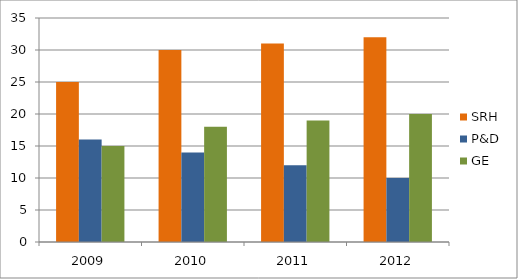
| Category | SRH | P&D | GE |
|---|---|---|---|
| 2009.0 | 25 | 16 | 15 |
| 2010.0 | 30 | 14 | 18 |
| 2011.0 | 31 | 12 | 19 |
| 2012.0 | 32 | 10 | 20 |